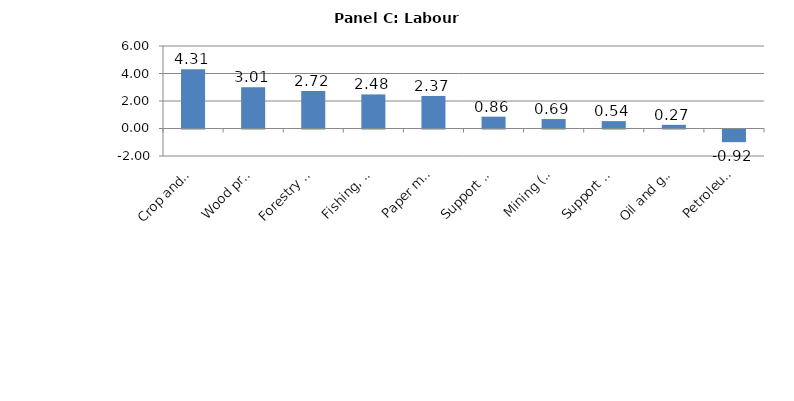
| Category | Series 0 |
|---|---|
| Crop and animal production | 4.315 |
| Wood product manufacturing | 3.006 |
| Forestry and logging | 2.722 |
| Fishing, hunting and trapping | 2.478 |
| Paper manufacturing | 2.367 |
| Support activities for agriculture and forestry | 0.86 |
| Mining (except oil and gas) | 0.688 |
| Support activities for mining and oil and gas | 0.538 |
| Oil and gas extraction | 0.266 |
| Petroleum and coal products manufacturing | -0.922 |